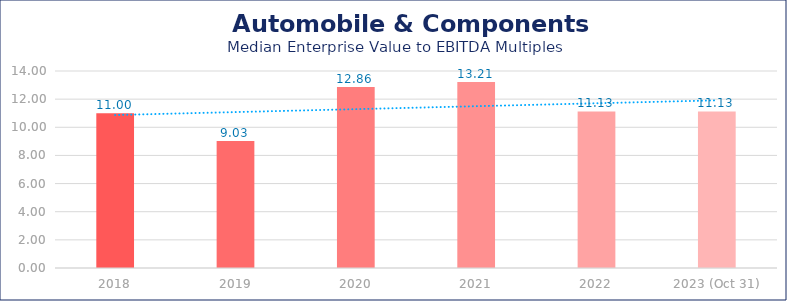
| Category | Automobile & Components |
|---|---|
| 2018 | 11 |
| 2019 | 9.03 |
| 2020 | 12.86 |
| 2021 | 13.21 |
| 2022 | 11.13 |
| 2023 (Oct 31) | 11.13 |